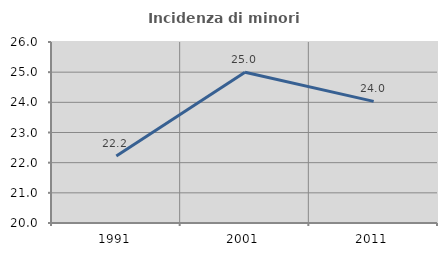
| Category | Incidenza di minori stranieri |
|---|---|
| 1991.0 | 22.222 |
| 2001.0 | 25 |
| 2011.0 | 24.031 |